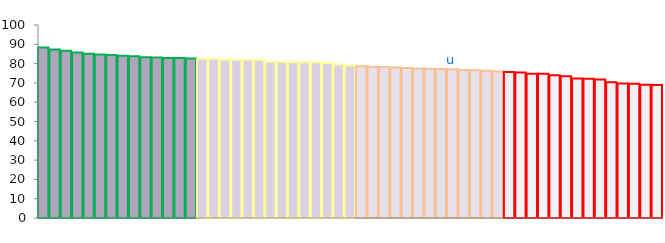
| Category | Top Quartile | 2nd Quartile | 3rd Quartile | Bottom Quartile | Series 4 |
|---|---|---|---|---|---|
|  | 88.291 | 0 | 0 | 0 | 88.291 |
|  | 87.282 | 0 | 0 | 0 | 87.282 |
|  | 86.656 | 0 | 0 | 0 | 86.656 |
|  | 85.738 | 0 | 0 | 0 | 85.738 |
|  | 85.168 | 0 | 0 | 0 | 85.168 |
|  | 84.778 | 0 | 0 | 0 | 84.778 |
|  | 84.446 | 0 | 0 | 0 | 84.446 |
|  | 84.097 | 0 | 0 | 0 | 84.097 |
|  | 83.814 | 0 | 0 | 0 | 83.814 |
|  | 83.247 | 0 | 0 | 0 | 83.247 |
|  | 83.195 | 0 | 0 | 0 | 83.195 |
|  | 82.96 | 0 | 0 | 0 | 82.96 |
|  | 82.959 | 0 | 0 | 0 | 82.959 |
|  | 82.674 | 0 | 0 | 0 | 82.674 |
|  | 0 | 82.574 | 0 | 0 | 82.574 |
|  | 0 | 82.561 | 0 | 0 | 82.561 |
|  | 0 | 82.129 | 0 | 0 | 82.129 |
|  | 0 | 82.036 | 0 | 0 | 82.036 |
|  | 0 | 81.982 | 0 | 0 | 81.982 |
|  | 0 | 81.871 | 0 | 0 | 81.871 |
|  | 0 | 80.928 | 0 | 0 | 80.928 |
|  | 0 | 80.88 | 0 | 0 | 80.88 |
|  | 0 | 80.856 | 0 | 0 | 80.856 |
|  | 0 | 80.715 | 0 | 0 | 80.715 |
|  | 0 | 80.711 | 0 | 0 | 80.711 |
|  | 0 | 80.324 | 0 | 0 | 80.324 |
|  | 0 | 79.58 | 0 | 0 | 79.58 |
|  | 0 | 79.103 | 0 | 0 | 79.103 |
|  | 0 | 0 | 78.582 | 0 | 78.582 |
|  | 0 | 0 | 78.401 | 0 | 78.401 |
|  | 0 | 0 | 78.246 | 0 | 78.246 |
|  | 0 | 0 | 77.964 | 0 | 77.964 |
|  | 0 | 0 | 77.753 | 0 | 77.753 |
|  | 0 | 0 | 77.424 | 0 | 77.424 |
|  | 0 | 0 | 77.287 | 0 | 77.287 |
|  | 0 | 0 | 77.145 | 0 | 77.145 |
| u | 0 | 0 | 77.112 | 0 | 77.112 |